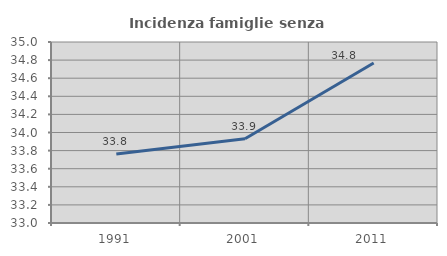
| Category | Incidenza famiglie senza nuclei |
|---|---|
| 1991.0 | 33.762 |
| 2001.0 | 33.931 |
| 2011.0 | 34.769 |